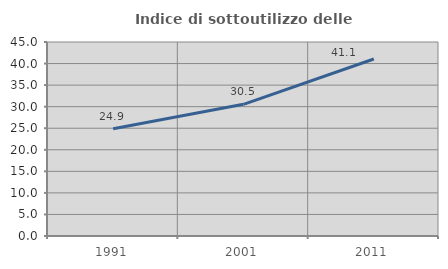
| Category | Indice di sottoutilizzo delle abitazioni  |
|---|---|
| 1991.0 | 24.888 |
| 2001.0 | 30.546 |
| 2011.0 | 41.054 |